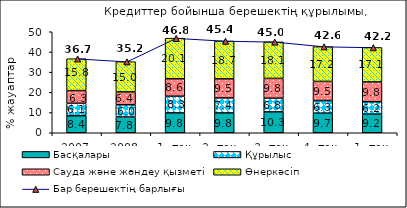
| Category | Басқалары  | Құрылыс | Сауда және жөндеу қызметі  | Өнеркәсіп |
|---|---|---|---|---|
| 2007 | 8.435 | 6.142 | 6.292 | 15.782 |
| 2008 | 7.808 | 6.045 | 6.37 | 14.98 |
| 1 -тоқ. 2009 | 9.832 | 8.273 | 8.633 | 20.084 |
| 2 -тоқ.  | 9.812 | 7.416 | 9.469 | 18.711 |
| 3 -тоқ. | 10.334 | 6.781 | 9.795 | 18.084 |
| 4 -тоқ. | 9.693 | 6.25 | 9.481 | 17.214 |
| 1 -тоқ. 2010  | 9.194 | 6.163 | 9.81 | 17.052 |